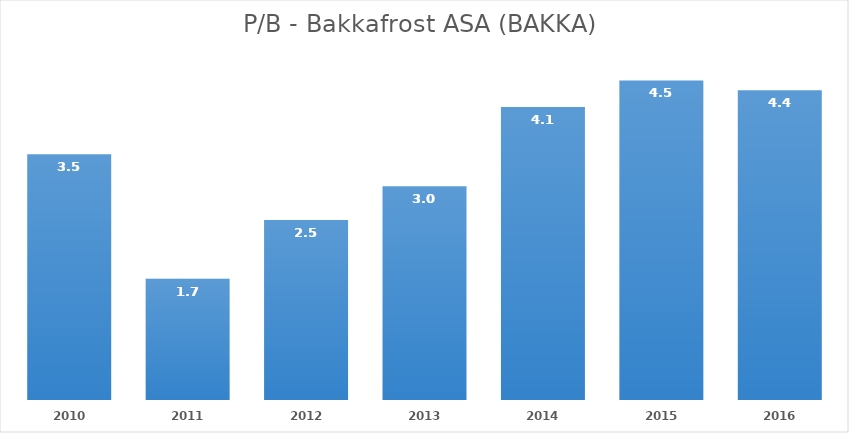
| Category | Series 0 |
|---|---|
| 2010.0 | 3.47 |
| 2011.0 | 1.713 |
| 2012.0 | 2.544 |
| 2013.0 | 3.02 |
| 2014.0 | 4.139 |
| 2015.0 | 4.513 |
| 2016.0 | 4.375 |